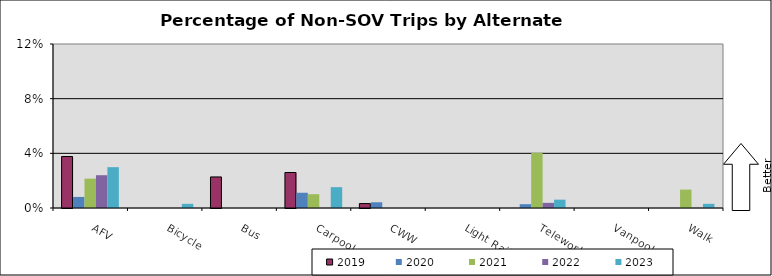
| Category | 2019 | 2020 | 2021 | 2022 | 2023 |
|---|---|---|---|---|---|
| AFV | 0.038 | 0.008 | 0.021 | 0.024 | 0.03 |
| Bicycle | 0 | 0 | 0 | 0 | 0.003 |
| Bus | 0.023 | 0 | 0 | 0 | 0 |
| Carpool | 0.026 | 0.011 | 0.01 | 0 | 0.015 |
| CWW | 0.003 | 0.004 | 0 | 0 | 0 |
| Light Rail | 0 | 0 | 0 | 0 | 0 |
| Telework | 0 | 0.003 | 0.04 | 0.004 | 0.006 |
| Vanpool | 0 | 0 | 0 | 0 | 0 |
| Walk | 0 | 0 | 0.013 | 0 | 0.003 |